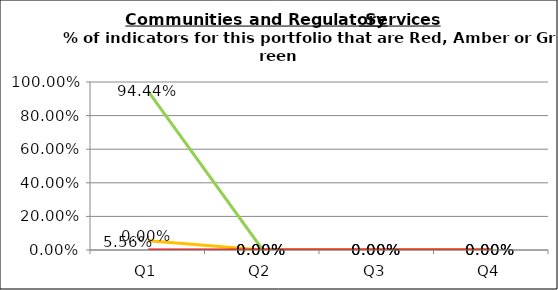
| Category | Green | Amber | Red |
|---|---|---|---|
| Q1 | 0.944 | 0.056 | 0 |
| Q2 | 0 | 0 | 0 |
| Q3 | 0 | 0 | 0 |
| Q4 | 0 | 0 | 0 |